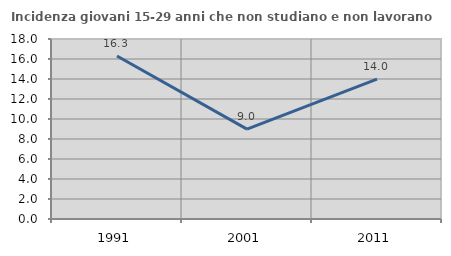
| Category | Incidenza giovani 15-29 anni che non studiano e non lavorano  |
|---|---|
| 1991.0 | 16.301 |
| 2001.0 | 8.984 |
| 2011.0 | 13.987 |